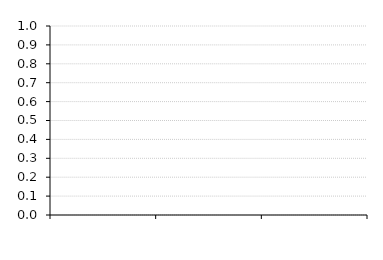
| Category | Times Interest Earned |
|---|---|
| 0 | 0 |
| 1 | 0 |
| 2 | 0 |